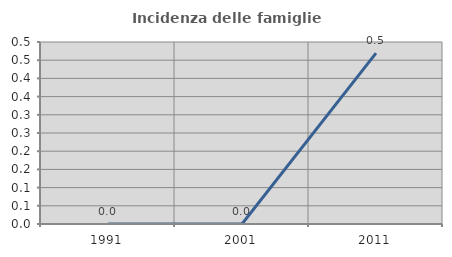
| Category | Incidenza delle famiglie numerose |
|---|---|
| 1991.0 | 0 |
| 2001.0 | 0 |
| 2011.0 | 0.469 |